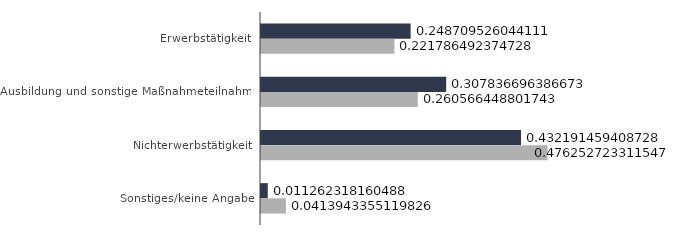
| Category |  Zugang |  Abgang  |
|---|---|---|
| Erwerbstätigkeit | 0.249 | 0.222 |
| Ausbildung und sonstige Maßnahmeteilnahme | 0.308 | 0.261 |
| Nichterwerbstätigkeit | 0.432 | 0.476 |
| Sonstiges/keine Angabe | 0.011 | 0.041 |